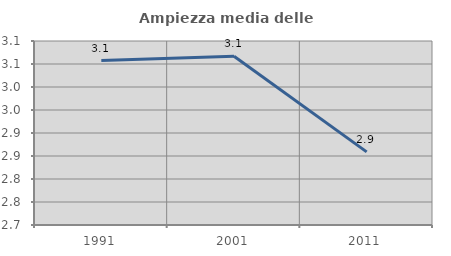
| Category | Ampiezza media delle famiglie |
|---|---|
| 1991.0 | 3.057 |
| 2001.0 | 3.067 |
| 2011.0 | 2.859 |